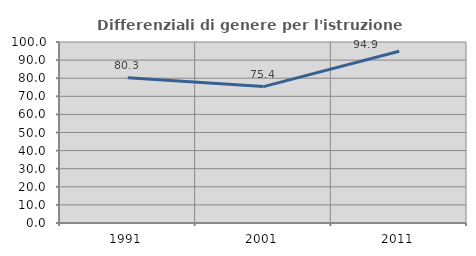
| Category | Differenziali di genere per l'istruzione superiore |
|---|---|
| 1991.0 | 80.302 |
| 2001.0 | 75.371 |
| 2011.0 | 94.854 |